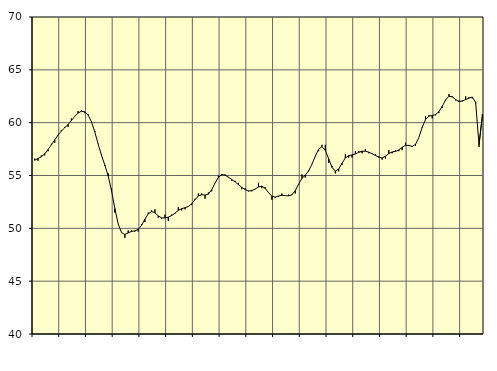
| Category | Piggar | Samtliga fast anställda (inkl. fast anställda utomlands) |
|---|---|---|
| nan | 56.6 | 56.44 |
| 87.0 | 56.4 | 56.61 |
| 87.0 | 56.9 | 56.77 |
| 87.0 | 56.9 | 57.05 |
| nan | 57.3 | 57.45 |
| 88.0 | 58 | 57.9 |
| 88.0 | 58.1 | 58.37 |
| 88.0 | 58.8 | 58.83 |
| nan | 59.3 | 59.21 |
| 89.0 | 59.6 | 59.52 |
| 89.0 | 59.6 | 59.84 |
| 89.0 | 60.4 | 60.21 |
| nan | 60.6 | 60.59 |
| 90.0 | 61.1 | 60.91 |
| 90.0 | 61.2 | 61.08 |
| 90.0 | 60.9 | 61.03 |
| nan | 60.8 | 60.72 |
| 91.0 | 60 | 60.09 |
| 91.0 | 59.2 | 59.11 |
| 91.0 | 58 | 57.98 |
| nan | 57 | 56.91 |
| 92.0 | 55.9 | 55.99 |
| 92.0 | 55.2 | 54.97 |
| 92.0 | 53.8 | 53.56 |
| nan | 51.5 | 51.88 |
| 93.0 | 50.4 | 50.41 |
| 93.0 | 49.6 | 49.59 |
| 93.0 | 49.1 | 49.42 |
| nan | 49.8 | 49.57 |
| 94.0 | 49.8 | 49.71 |
| 94.0 | 49.7 | 49.76 |
| 94.0 | 49.7 | 49.9 |
| nan | 50.4 | 50.29 |
| 95.0 | 50.6 | 50.86 |
| 95.0 | 51.5 | 51.37 |
| 95.0 | 51.7 | 51.6 |
| nan | 51.8 | 51.47 |
| 96.0 | 51 | 51.18 |
| 96.0 | 50.9 | 50.99 |
| 96.0 | 51.3 | 50.98 |
| nan | 50.7 | 51.06 |
| 97.0 | 51.3 | 51.21 |
| 97.0 | 51.4 | 51.44 |
| 97.0 | 52 | 51.7 |
| nan | 51.7 | 51.86 |
| 98.0 | 51.8 | 51.95 |
| 98.0 | 52.1 | 52.07 |
| 98.0 | 52.2 | 52.32 |
| nan | 52.8 | 52.71 |
| 99.0 | 53.3 | 53.07 |
| 99.0 | 53.3 | 53.18 |
| 99.0 | 52.8 | 53.15 |
| nan | 53.4 | 53.24 |
| 0.0 | 53.5 | 53.66 |
| 0.0 | 54.3 | 54.29 |
| 0.0 | 55 | 54.83 |
| nan | 55 | 55.09 |
| 1.0 | 55.1 | 55.03 |
| 1.0 | 54.8 | 54.84 |
| 1.0 | 54.5 | 54.62 |
| nan | 54.5 | 54.39 |
| 2.0 | 54.3 | 54.13 |
| 2.0 | 53.7 | 53.88 |
| 2.0 | 53.8 | 53.67 |
| nan | 53.5 | 53.54 |
| 3.0 | 53.5 | 53.57 |
| 3.0 | 53.7 | 53.72 |
| 3.0 | 54.3 | 53.91 |
| nan | 53.8 | 53.99 |
| 4.0 | 53.9 | 53.78 |
| 4.0 | 53.4 | 53.38 |
| 4.0 | 52.7 | 53.04 |
| nan | 52.9 | 52.95 |
| 5.0 | 53 | 53.06 |
| 5.0 | 53.3 | 53.12 |
| 5.0 | 53.1 | 53.1 |
| nan | 53.2 | 53.07 |
| 6.0 | 53.2 | 53.16 |
| 6.0 | 53.3 | 53.57 |
| 6.0 | 54.1 | 54.18 |
| nan | 55.1 | 54.72 |
| 7.0 | 54.8 | 55.05 |
| 7.0 | 55.5 | 55.43 |
| 7.0 | 56.1 | 56.07 |
| nan | 56.8 | 56.82 |
| 8.0 | 57.3 | 57.49 |
| 8.0 | 57.9 | 57.73 |
| 8.0 | 57.9 | 57.38 |
| nan | 56.2 | 56.58 |
| 9.0 | 55.9 | 55.77 |
| 9.0 | 55.2 | 55.42 |
| 9.0 | 55.4 | 55.61 |
| nan | 56 | 56.16 |
| 10.0 | 57 | 56.66 |
| 10.0 | 56.7 | 56.88 |
| 10.0 | 56.7 | 56.95 |
| nan | 57.3 | 57.04 |
| 11.0 | 57.3 | 57.19 |
| 11.0 | 57.1 | 57.3 |
| 11.0 | 57.5 | 57.3 |
| nan | 57.1 | 57.21 |
| 12.0 | 57.1 | 57.06 |
| 12.0 | 57 | 56.9 |
| 12.0 | 56.8 | 56.73 |
| nan | 56.5 | 56.66 |
| 13.0 | 56.6 | 56.82 |
| 13.0 | 57.4 | 57.08 |
| 13.0 | 57.1 | 57.23 |
| nan | 57.4 | 57.28 |
| 14.0 | 57.3 | 57.42 |
| 14.0 | 57.4 | 57.67 |
| 14.0 | 58.1 | 57.85 |
| nan | 57.8 | 57.85 |
| 15.0 | 57.7 | 57.75 |
| 15.0 | 57.8 | 57.94 |
| 15.0 | 58.6 | 58.6 |
| nan | 59.5 | 59.56 |
| 16.0 | 60.6 | 60.3 |
| 16.0 | 60.7 | 60.62 |
| 16.0 | 60.4 | 60.68 |
| nan | 60.7 | 60.76 |
| 17.0 | 60.9 | 61.03 |
| 17.0 | 61.4 | 61.55 |
| 17.0 | 62.1 | 62.15 |
| nan | 62.7 | 62.5 |
| 18.0 | 62.4 | 62.46 |
| 18.0 | 62.1 | 62.19 |
| 18.0 | 62.1 | 62 |
| nan | 62.1 | 62.04 |
| 19.0 | 62.5 | 62.19 |
| 19.0 | 62.4 | 62.32 |
| 19.0 | 62.3 | 62.43 |
| nan | 61.8 | 61.91 |
| 20.0 | 57.7 | 57.91 |
| 20.0 | 60.8 | 60.62 |